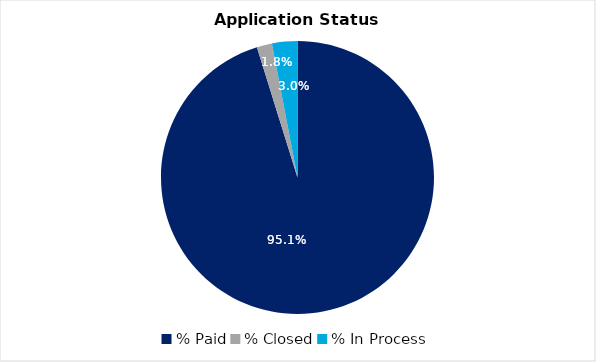
| Category | Series 0 |
|---|---|
| % Paid | 0.951 |
| % Closed | 0.018 |
| % In Process | 0.03 |